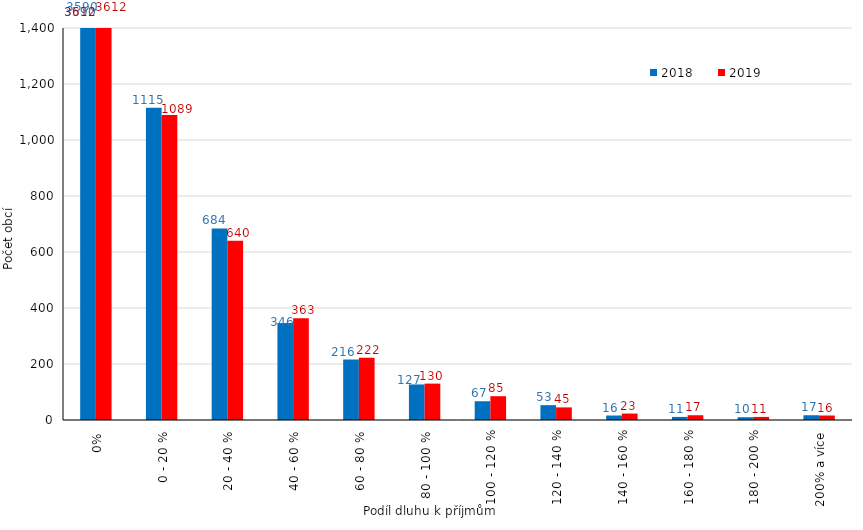
| Category | 2018 | 2019 |
|---|---|---|
| 0% | 3590 | 3612 |
| 0 - 20 % | 1115 | 1089 |
| 20 - 40 % | 684 | 640 |
| 40 - 60 % | 346 | 363 |
| 60 - 80 % | 216 | 222 |
| 80 - 100 % | 127 | 130 |
| 100 - 120 % | 67 | 85 |
| 120 - 140 % | 53 | 45 |
| 140 - 160 % | 16 | 23 |
| 160 - 180 % | 11 | 17 |
| 180 - 200 % | 10 | 11 |
| 200% a více | 17 | 16 |